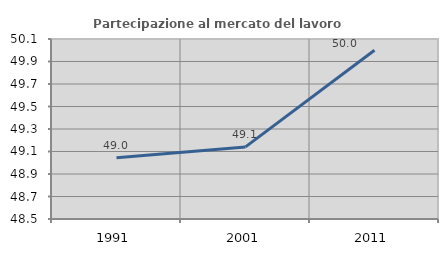
| Category | Partecipazione al mercato del lavoro  femminile |
|---|---|
| 1991.0 | 49.043 |
| 2001.0 | 49.141 |
| 2011.0 | 50 |